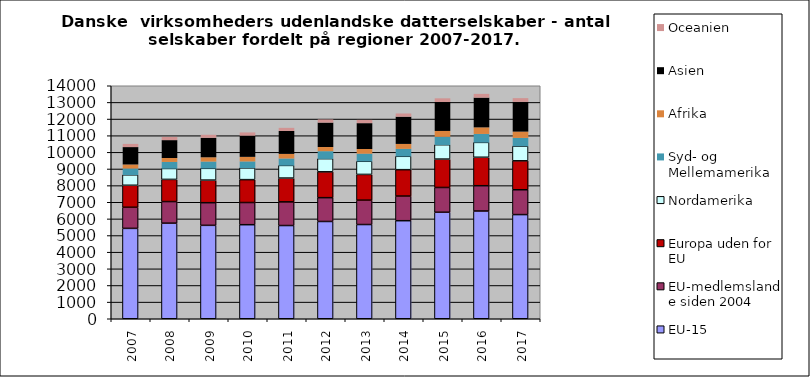
| Category | EU-15 | EU-medlemslande siden 2004 | Europa uden for EU | Nordamerika | Syd- og Mellemamerika | Afrika | Asien | Oceanien |
|---|---|---|---|---|---|---|---|---|
| 2007 | 5431 | 1267 | 1322 | 629 | 395 | 241 | 1045 | 191 |
| 2008 | 5743 | 1299 | 1331 | 658 | 407 | 237 | 1073 | 191 |
| 2009 | 5613 | 1360 | 1358 | 708 | 422 | 257 | 1170 | 182 |
| 2010 | 5651 | 1333 | 1375 | 706 | 403 | 275 | 1272 | 195 |
| 2011 | 5602 | 1421 | 1430 | 761 | 431 | 276 | 1377 | 187 |
| 2012 | 5845 | 1431 | 1552 | 792 | 463 | 250 | 1468 | 189 |
| 2013 | 5662 | 1463 | 1548 | 789 | 471 | 280 | 1555 | 196 |
| 2014 | 5892 | 1479 | 1587 | 804 | 461 | 297 | 1636 | 193 |
| 2015 | 6400 | 1488 | 1705 | 865 | 489 | 353 | 1738 | 222 |
| 2016 | 6474 | 1520 | 1709 | 895 | 522 | 395 | 1786 | 226 |
| 2017 | 6259 | 1492 | 1739 | 885 | 507 | 378 | 1786 | 225 |